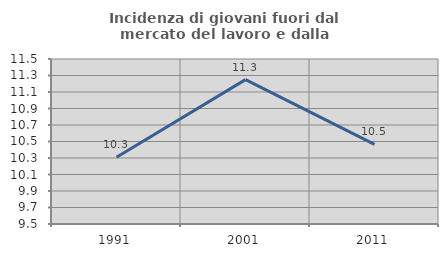
| Category | Incidenza di giovani fuori dal mercato del lavoro e dalla formazione  |
|---|---|
| 1991.0 | 10.309 |
| 2001.0 | 11.25 |
| 2011.0 | 10.465 |